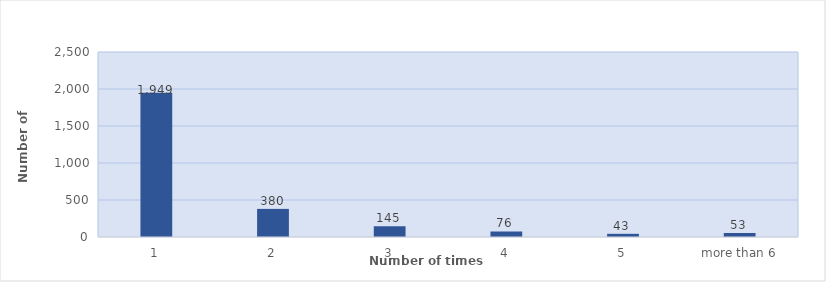
| Category | Series 0 |
|---|---|
| 1 | 1949 |
| 2 | 380 |
| 3 | 145 |
| 4 | 76 |
| 5 | 43 |
| more than 6 | 53 |